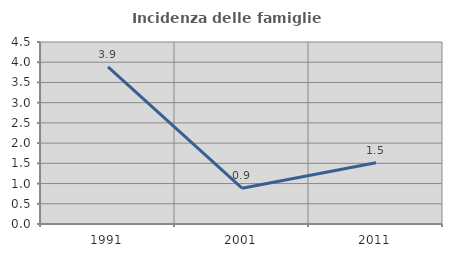
| Category | Incidenza delle famiglie numerose |
|---|---|
| 1991.0 | 3.883 |
| 2001.0 | 0.885 |
| 2011.0 | 1.515 |